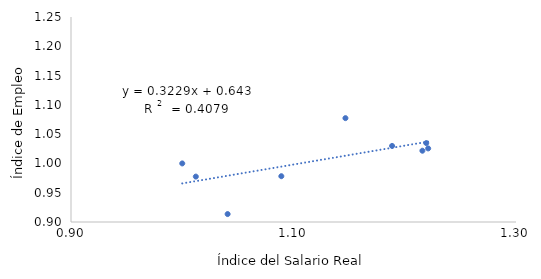
| Category | Series 0 |
|---|---|
| 0 | 1 |
| 1 | 0.978 |
| 2 | 0.914 |
| 3 | 0.978 |
| 4 | 1.077 |
| 5 | 1.035 |
| 6 | 1.03 |
| 7 | 1.022 |
| 8 | 1.026 |